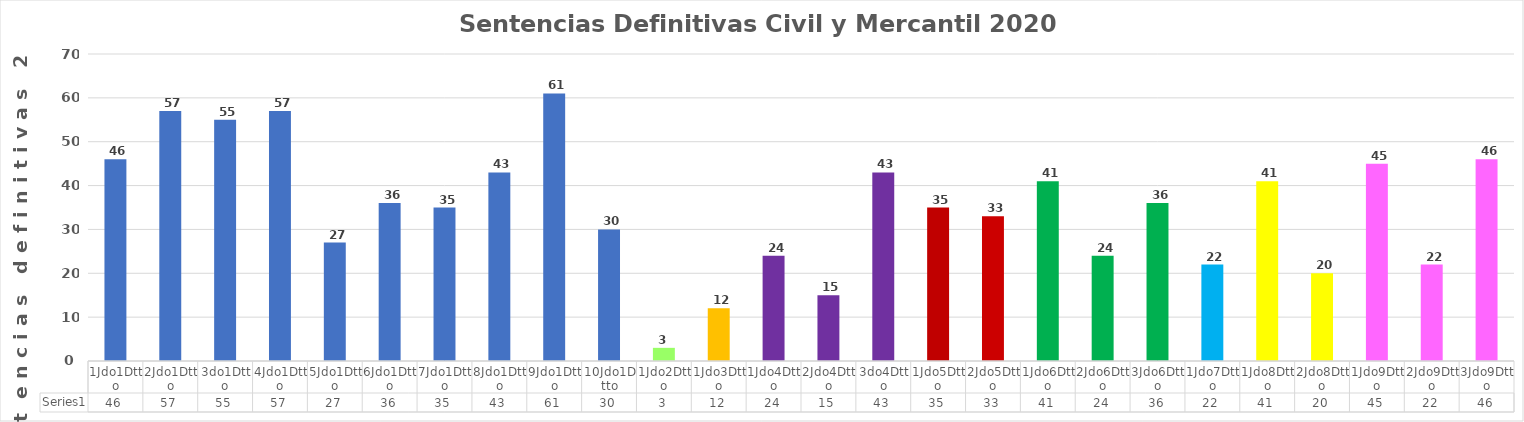
| Category | Series 0 |
|---|---|
| 1Jdo1Dtto | 46 |
| 2Jdo1Dtto | 57 |
| 3do1Dtto | 55 |
| 4Jdo1Dtto | 57 |
| 5Jdo1Dtto | 27 |
| 6Jdo1Dtto | 36 |
| 7Jdo1Dtto | 35 |
| 8Jdo1Dtto | 43 |
| 9Jdo1Dtto | 61 |
| 10Jdo1Dtto | 30 |
| 1Jdo2Dtto | 3 |
| 1Jdo3Dtto | 12 |
| 1Jdo4Dtto | 24 |
| 2Jdo4Dtto | 15 |
| 3do4Dtto | 43 |
| 1Jdo5Dtto | 35 |
| 2Jdo5Dtto | 33 |
| 1Jdo6Dtto | 41 |
| 2Jdo6Dtto | 24 |
| 3Jdo6Dtto | 36 |
| 1Jdo7Dtto | 22 |
| 1Jdo8Dtto | 41 |
| 2Jdo8Dtto | 20 |
| 1Jdo9Dtto | 45 |
| 2Jdo9Dtto | 22 |
| 3Jdo9Dtto | 46 |